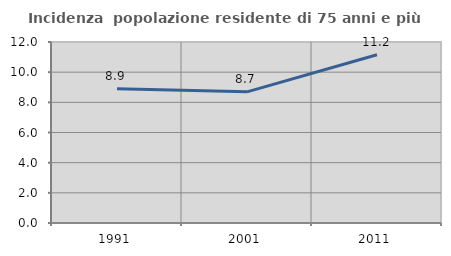
| Category | Incidenza  popolazione residente di 75 anni e più |
|---|---|
| 1991.0 | 8.905 |
| 2001.0 | 8.696 |
| 2011.0 | 11.158 |